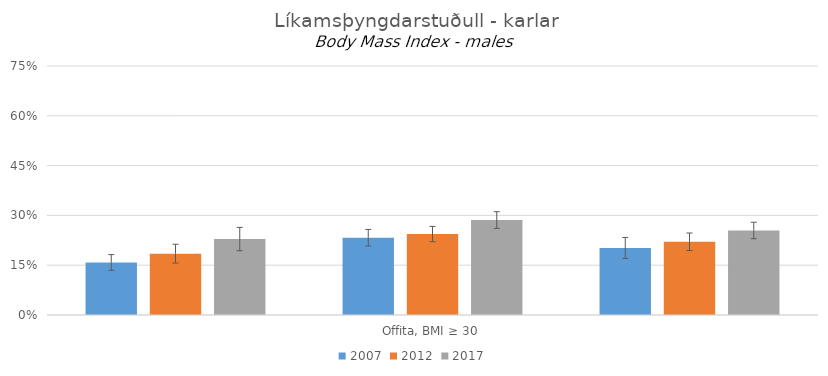
| Category | 2007 | 2012 | 2017 |
|---|---|---|---|
| 0 | 0.158 | 0.185 | 0.229 |
| 1 | 0.233 | 0.244 | 0.286 |
| 2 | 0.202 | 0.221 | 0.255 |